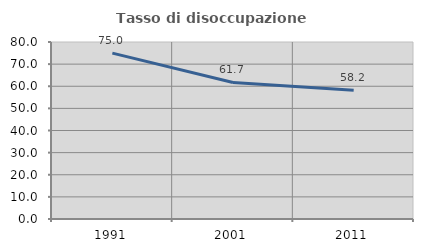
| Category | Tasso di disoccupazione giovanile  |
|---|---|
| 1991.0 | 74.984 |
| 2001.0 | 61.712 |
| 2011.0 | 58.171 |